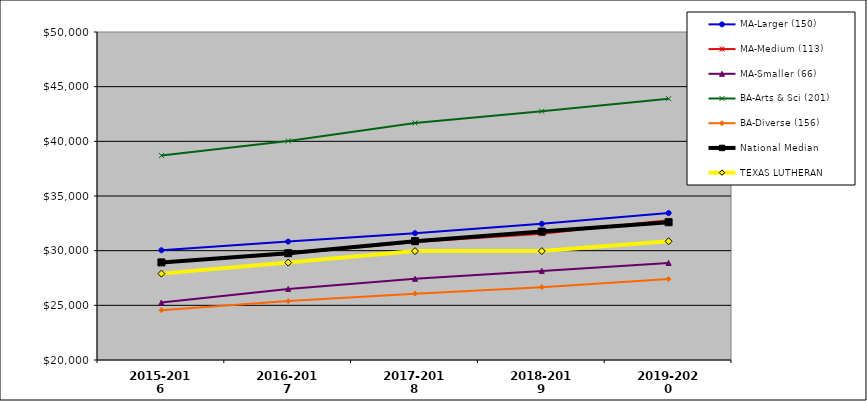
| Category | MA-Larger (150) | MA-Medium (113) | MA-Smaller (66) | BA-Arts & Sci (201) | BA-Diverse (156) | National Median | TEXAS LUTHERAN |
|---|---|---|---|---|---|---|---|
| 2015-2016 | 30037 | 28917 | 25260 | 38705 | 24557 | 28924.5 | 27900 |
| 2016-2017 | 30830 | 29696 | 26503 | 40040 | 25386.5 | 29767 | 28910 |
| 2017-2018 | 31600 | 30794 | 27427.5 | 41682 | 26070 | 30869 | 29960 |
| 2018-2019 | 32454 | 31540 | 28150.5 | 42746 | 26664 | 31745 | 29960 |
| 2019-2020 | 33440 | 32772 | 28879.5 | 43900 | 27400 | 32598 | 30860 |